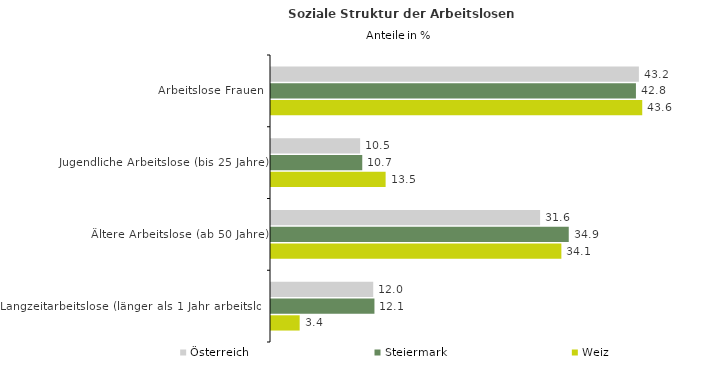
| Category | Österreich | Steiermark | Weiz |
|---|---|---|---|
| Arbeitslose Frauen | 43.18 | 42.833 | 43.572 |
| Jugendliche Arbeitslose (bis 25 Jahre) | 10.46 | 10.711 | 13.453 |
| Ältere Arbeitslose (ab 50 Jahre) | 31.584 | 34.947 | 34.081 |
| Langzeitarbeitslose (länger als 1 Jahr arbeitslos) | 11.999 | 12.142 | 3.363 |